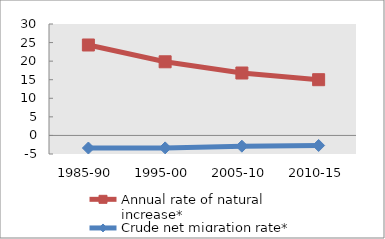
| Category | Annual rate of natural increase* | Crude net migration rate* |
|---|---|---|
| 1985-90 | 24.348 | -3.389 |
| 1995-00 | 19.827 | -3.351 |
| 2005-10 | 16.806 | -2.893 |
| 2010-15 | 15.004 | -2.709 |